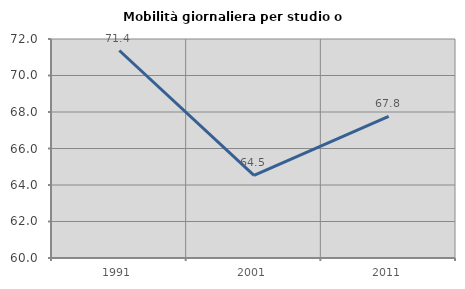
| Category | Mobilità giornaliera per studio o lavoro |
|---|---|
| 1991.0 | 71.369 |
| 2001.0 | 64.532 |
| 2011.0 | 67.759 |